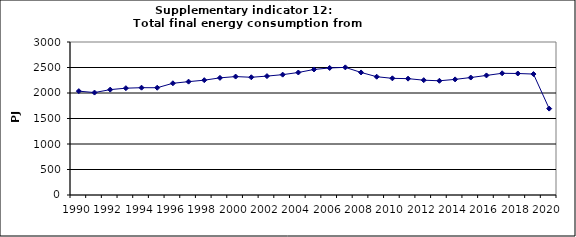
| Category | Total final energy consumption from transport, PJ |
|---|---|
| 1990 | 2036.25 |
| 1991 | 2008.534 |
| 1992 | 2066.395 |
| 1993 | 2094.405 |
| 1994 | 2103.993 |
| 1995 | 2103.365 |
| 1996 | 2190.592 |
| 1997 | 2222.459 |
| 1998 | 2251.326 |
| 1999 | 2296.589 |
| 2000 | 2322.046 |
| 2001 | 2308.488 |
| 2002 | 2331.413 |
| 2003 | 2359.923 |
| 2004 | 2402.141 |
| 2005 | 2461.552 |
| 2006 | 2491.207 |
| 2007 | 2502.489 |
| 2008 | 2402.943 |
| 2009 | 2319.216 |
| 2010 | 2287.498 |
| 2011 | 2281.518 |
| 2012 | 2251.513 |
| 2013 | 2239.507 |
| 2014 | 2266.977 |
| 2015 | 2303.269 |
| 2016 | 2344.63 |
| 2017 | 2386.584 |
| 2018 | 2382.356 |
| 2019 | 2371.596 |
| 2020 | 1694.018 |